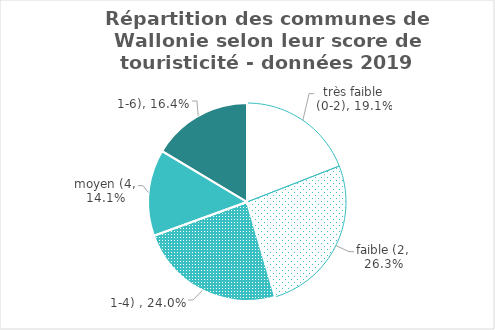
| Category | Total |
|---|---|
| très faible (0-2) | 0.191 |
| faible (2,1-4)  | 0.263 |
| moyen (4,1-6) | 0.24 |
| haut (6,1-8 | 0.141 |
| très haut (8,1-10) | 0.164 |